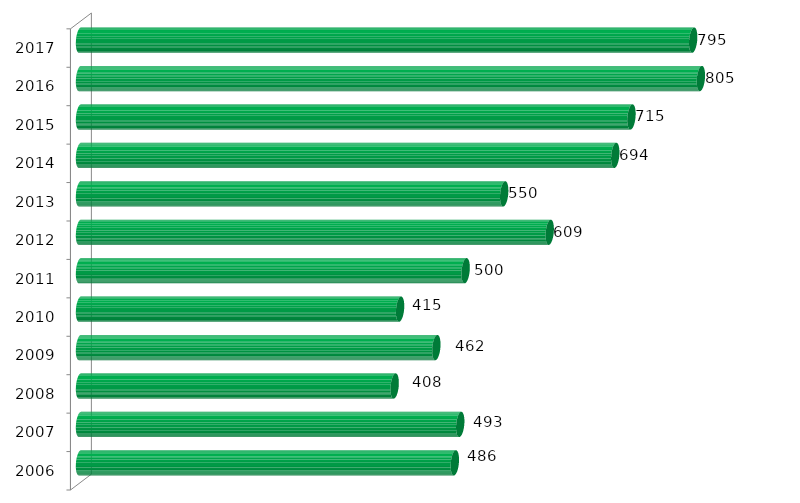
| Category | Concluintes |
|---|---|
| 2006.0 | 486 |
| 2007.0 | 493 |
| 2008.0 | 408 |
| 2009.0 | 462 |
| 2010.0 | 415 |
| 2011.0 | 500 |
| 2012.0 | 609 |
| 2013.0 | 550 |
| 2014.0 | 694 |
| 2015.0 | 715 |
| 2016.0 | 805 |
| 2017.0 | 795 |